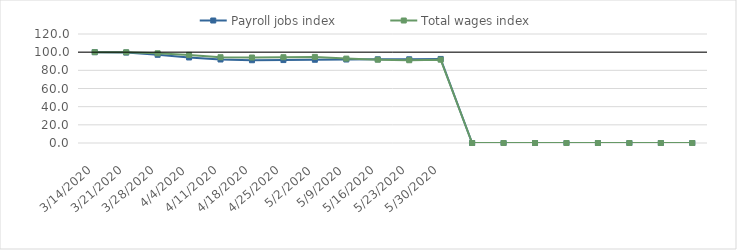
| Category | Payroll jobs index | Total wages index |
|---|---|---|
| 14/03/2020 | 100 | 100 |
| 21/03/2020 | 99.552 | 99.902 |
| 28/03/2020 | 97.088 | 98.771 |
| 04/04/2020 | 94.15 | 97.007 |
| 11/04/2020 | 91.933 | 94.434 |
| 18/04/2020 | 91.108 | 94.115 |
| 25/04/2020 | 91.306 | 94.452 |
| 02/05/2020 | 91.63 | 94.778 |
| 09/05/2020 | 91.91 | 92.892 |
| 16/05/2020 | 92.165 | 91.712 |
| 23/05/2020 | 92.167 | 91.106 |
| 30/05/2020 | 92.546 | 91.708 |